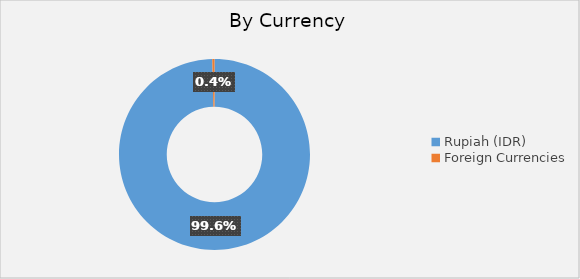
| Category | G. Valuta Simpanan |
|---|---|
| Rupiah (IDR) | 338943933 |
| Foreign Currencies | 1263034 |